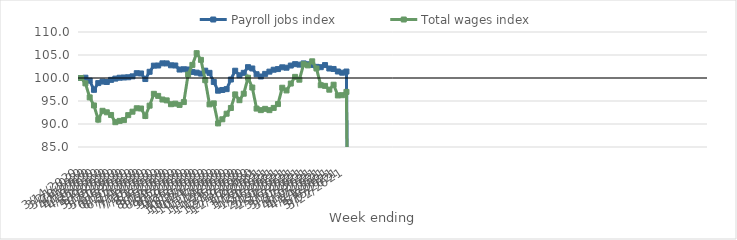
| Category | Payroll jobs index | Total wages index |
|---|---|---|
| 14/03/2020 | 100 | 100 |
| 21/03/2020 | 100.065 | 98.835 |
| 28/03/2020 | 99.435 | 95.785 |
| 04/04/2020 | 97.432 | 94.031 |
| 11/04/2020 | 98.891 | 90.946 |
| 18/04/2020 | 99.221 | 92.868 |
| 25/04/2020 | 99.135 | 92.542 |
| 02/05/2020 | 99.594 | 91.966 |
| 09/05/2020 | 99.866 | 90.391 |
| 16/05/2020 | 100.06 | 90.676 |
| 23/05/2020 | 100.111 | 90.848 |
| 30/05/2020 | 100.161 | 91.929 |
| 06/06/2020 | 100.358 | 92.676 |
| 13/06/2020 | 101.043 | 93.421 |
| 20/06/2020 | 100.987 | 93.367 |
| 27/06/2020 | 99.773 | 91.735 |
| 04/07/2020 | 101.349 | 93.989 |
| 11/07/2020 | 102.686 | 96.562 |
| 18/07/2020 | 102.716 | 96.114 |
| 25/07/2020 | 103.184 | 95.32 |
| 01/08/2020 | 103.17 | 95.134 |
| 08/08/2020 | 102.765 | 94.301 |
| 15/08/2020 | 102.718 | 94.425 |
| 22/08/2020 | 101.84 | 94.149 |
| 29/08/2020 | 101.9 | 94.768 |
| 05/09/2020 | 101.849 | 100.753 |
| 12/09/2020 | 101.315 | 102.851 |
| 19/09/2020 | 101.163 | 105.396 |
| 26/09/2020 | 100.962 | 103.944 |
| 03/10/2020 | 101.592 | 99.523 |
| 10/10/2020 | 101.12 | 94.27 |
| 17/10/2020 | 99.143 | 94.481 |
| 24/10/2020 | 97.242 | 90.128 |
| 31/10/2020 | 97.396 | 91.024 |
| 07/11/2020 | 97.579 | 92.237 |
| 14/11/2020 | 99.67 | 93.484 |
| 21/11/2020 | 101.582 | 96.432 |
| 28/11/2020 | 100.585 | 95.176 |
| 05/12/2020 | 101.124 | 96.588 |
| 12/12/2020 | 102.356 | 100.061 |
| 19/12/2020 | 102.071 | 97.928 |
| 26/12/2020 | 100.82 | 93.352 |
| 02/01/2021 | 100.332 | 93.013 |
| 09/01/2021 | 100.9 | 93.292 |
| 16/01/2021 | 101.383 | 93.013 |
| 23/01/2021 | 101.797 | 93.496 |
| 30/01/2021 | 101.939 | 94.331 |
| 06/02/2021 | 102.322 | 97.887 |
| 13/02/2021 | 102.239 | 97.295 |
| 20/02/2021 | 102.705 | 98.792 |
| 27/02/2021 | 103.011 | 100.246 |
| 06/03/2021 | 102.905 | 99.634 |
| 13/03/2021 | 103.17 | 102.996 |
| 20/03/2021 | 102.987 | 102.739 |
| 27/03/2021 | 102.841 | 103.627 |
| 03/04/2021 | 102.42 | 102.058 |
| 10/04/2021 | 102.353 | 98.436 |
| 17/04/2021 | 102.812 | 98.29 |
| 24/04/2021 | 102.06 | 97.46 |
| 01/05/2021 | 101.966 | 98.54 |
| 08/05/2021 | 101.413 | 96.212 |
| 15/05/2021 | 101.153 | 96.263 |
| 22/05/2021 | 101.406 | 96.982 |